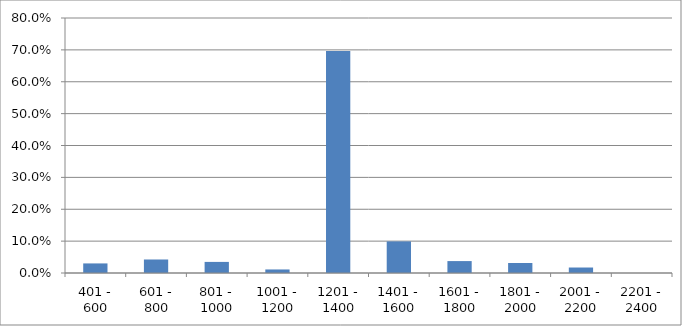
| Category | Series 0 |
|---|---|
| 401 - 600 | 0.03 |
| 601 - 800 | 0.042 |
| 801 - 1000 | 0.035 |
| 1001 - 1200 | 0.011 |
| 1201 - 1400 | 0.696 |
| 1401 - 1600 | 0.099 |
| 1601 - 1800 | 0.037 |
| 1801 - 2000 | 0.031 |
| 2001 - 2200 | 0.017 |
| 2201 - 2400 | 0 |